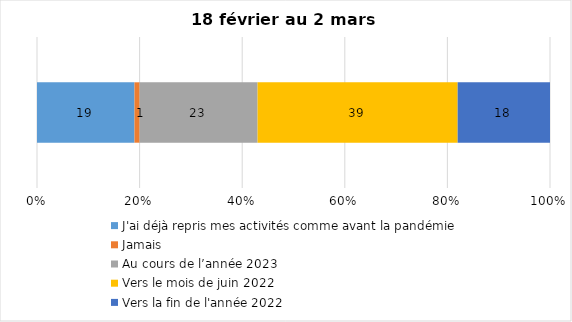
| Category | J'ai déjà repris mes activités comme avant la pandémie | Jamais | Au cours de l’année 2023 | Vers le mois de juin 2022 | Vers la fin de l'année 2022 |
|---|---|---|---|---|---|
| 0 | 19 | 1 | 23 | 39 | 18 |